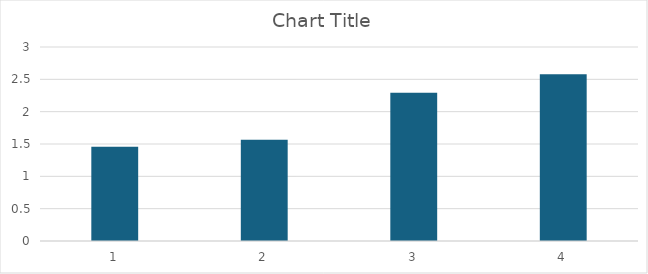
| Category | Series 0 |
|---|---|
| 0 | 1.458 |
| 1 | 1.564 |
| 2 | 2.293 |
| 3 | 2.578 |